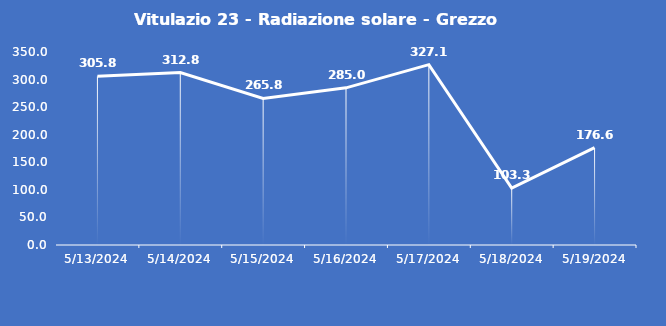
| Category | Vitulazio 23 - Radiazione solare - Grezzo (W/m2) |
|---|---|
| 5/13/24 | 305.8 |
| 5/14/24 | 312.8 |
| 5/15/24 | 265.8 |
| 5/16/24 | 285 |
| 5/17/24 | 327.1 |
| 5/18/24 | 103.3 |
| 5/19/24 | 176.6 |